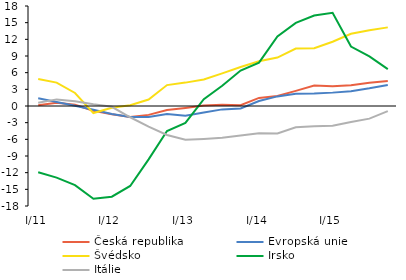
| Category | Česká republika | Evropská unie | Švédsko | Irsko | Itálie |
|---|---|---|---|---|---|
| I/11 | 0.12 | 1.395 | 4.86 | -11.924 | 0.583 |
| II | 0.569 | 0.719 | 4.216 | -12.892 | 1.19 |
| III | 0.23 | 0.03 | 2.344 | -14.251 | 0.867 |
| IV | -0.86 | -0.668 | -1.272 | -16.689 | 0.319 |
| I/12 | -1.488 | -1.435 | -0.321 | -16.327 | -0.14 |
| II | -1.976 | -1.973 | 0.145 | -14.391 | -2.026 |
| III | -1.598 | -1.996 | 1.174 | -9.61 | -3.725 |
| IV | -0.716 | -1.426 | 3.765 | -4.496 | -5.223 |
| I/13 | -0.345 | -1.769 | 4.21 | -3.033 | -6.084 |
| II | 0.091 | -1.163 | 4.784 | 1.222 | -5.931 |
| III | 0.234 | -0.608 | 5.87 | 3.648 | -5.717 |
| IV | 0.152 | -0.438 | 7.018 | 6.382 | -5.312 |
| I/14 | 1.455 | 0.896 | 8.042 | 7.8 | -4.891 |
| II | 1.801 | 1.73 | 8.716 | 12.502 | -4.932 |
| III | 2.725 | 2.202 | 10.346 | 14.951 | -3.843 |
| IV | 3.704 | 2.241 | 10.403 | 16.288 | -3.647 |
| I/15 | 3.539 | 2.408 | 11.564 | 16.787 | -3.551 |
| II | 3.738 | 2.676 | 13.006 | 10.704 | -2.865 |
| III | 4.2 | 3.181 | 13.654 | 8.923 | -2.276 |
| IV | 4.511 | 3.773 | 14.151 | 6.628 | -0.92 |